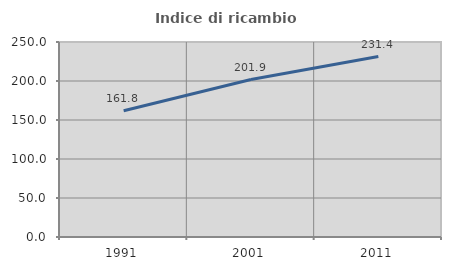
| Category | Indice di ricambio occupazionale  |
|---|---|
| 1991.0 | 161.765 |
| 2001.0 | 201.852 |
| 2011.0 | 231.387 |